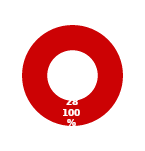
| Category | ARCHITECTURE |
|---|---|
| MIL 2 Complete | 0 |
| MIL 2 Not Complete | 28 |